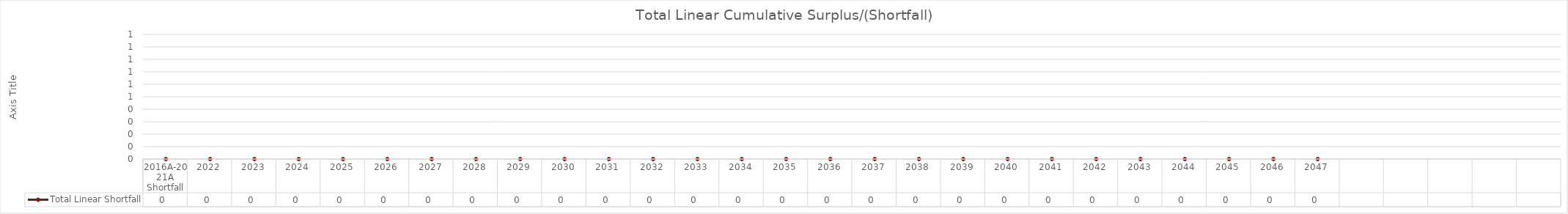
| Category | Total Linear Shortfall |
|---|---|
| 2016A-2021A Shortfall | 0 |
| 2022 | 0 |
| 2023 | 0 |
| 2024 | 0 |
| 2025 | 0 |
| 2026 | 0 |
| 2027 | 0 |
| 2028 | 0 |
| 2029 | 0 |
| 2030 | 0 |
| 2031 | 0 |
| 2032 | 0 |
| 2033 | 0 |
| 2034 | 0 |
| 2035 | 0 |
| 2036 | 0 |
| 2037 | 0 |
| 2038 | 0 |
| 2039 | 0 |
| 2040 | 0 |
| 2041 | 0 |
| 2042 | 0 |
| 2043 | 0 |
| 2044 | 0 |
| 2045 | 0 |
| 2046 | 0 |
| 2047 | 0 |